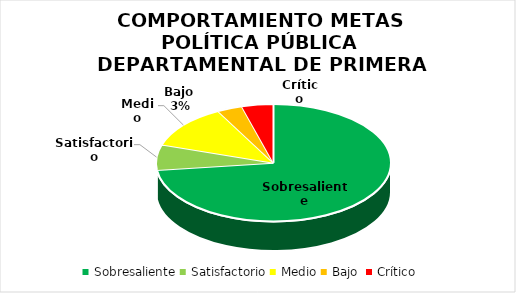
| Category | Series 0 |
|---|---|
| Sobresaliente | 84 |
| Satisfactorio | 8 |
| Medio | 14 |
| Bajo  | 4 |
| Crítico | 5 |